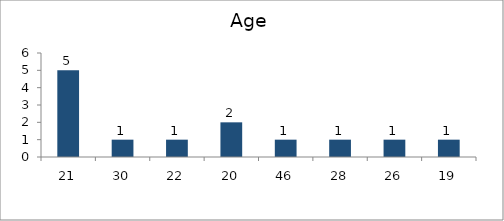
| Category | Age |
|---|---|
| 21.0 | 5 |
| 30.0 | 1 |
| 22.0 | 1 |
| 20.0 | 2 |
| 46.0 | 1 |
| 28.0 | 1 |
| 26.0 | 1 |
| 19.0 | 1 |